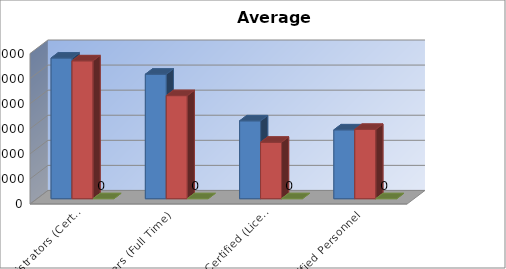
| Category | 2014-2015 | 2015-2016 | 2016-2017 |
|---|---|---|---|
| Administrators (Certified/Non-Certified) | 56123 | 55000 | 0 |
| Teachers (Full Time) | 49652 | 41106 | 0 |
| Other Certified (Licensed) Personnel | 31061 | 22509 | 0 |
| Classified Personnel | 27466 | 27656 | 0 |